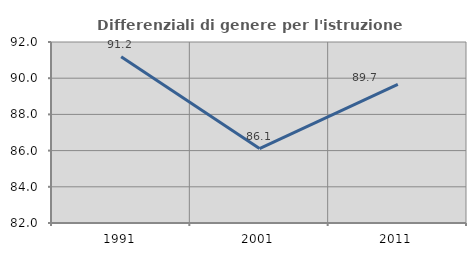
| Category | Differenziali di genere per l'istruzione superiore |
|---|---|
| 1991.0 | 91.187 |
| 2001.0 | 86.11 |
| 2011.0 | 89.657 |